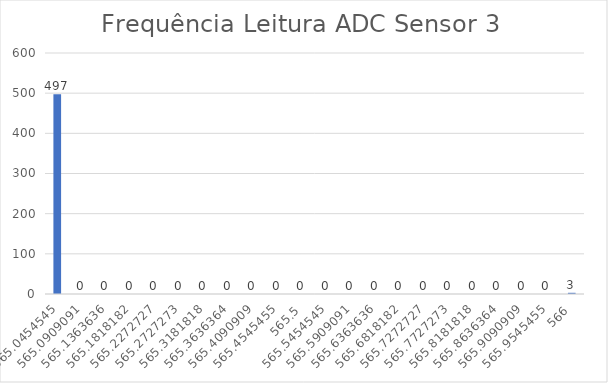
| Category | Series 0 |
|---|---|
| 565.0454545454545 | 497 |
| 565.0909090909091 | 0 |
| 565.1363636363636 | 0 |
| 565.1818181818181 | 0 |
| 565.2272727272727 | 0 |
| 565.2727272727273 | 0 |
| 565.3181818181819 | 0 |
| 565.3636363636364 | 0 |
| 565.4090909090909 | 0 |
| 565.4545454545455 | 0 |
| 565.5 | 0 |
| 565.5454545454545 | 0 |
| 565.5909090909091 | 0 |
| 565.6363636363636 | 0 |
| 565.6818181818181 | 0 |
| 565.7272727272727 | 0 |
| 565.7727272727273 | 0 |
| 565.8181818181819 | 0 |
| 565.8636363636364 | 0 |
| 565.9090909090909 | 0 |
| 565.9545454545455 | 0 |
| 566.0 | 3 |